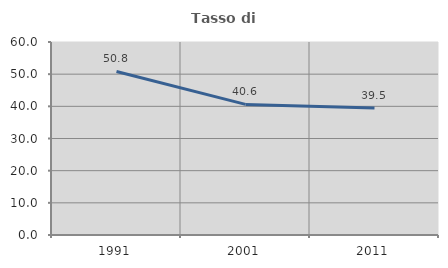
| Category | Tasso di occupazione   |
|---|---|
| 1991.0 | 50.835 |
| 2001.0 | 40.608 |
| 2011.0 | 39.506 |